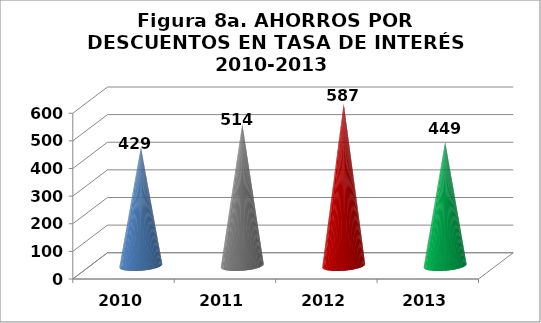
| Category | (Ahorros Mill de PESOS) |
|---|---|
| 0 | 429 |
| 1 | 514 |
| 2 | 587 |
| 3 | 449 |